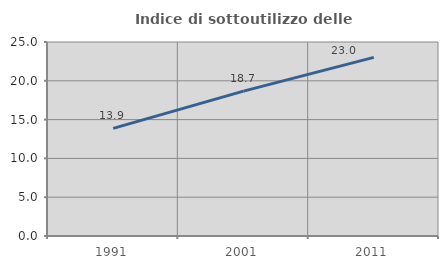
| Category | Indice di sottoutilizzo delle abitazioni  |
|---|---|
| 1991.0 | 13.864 |
| 2001.0 | 18.667 |
| 2011.0 | 23.02 |